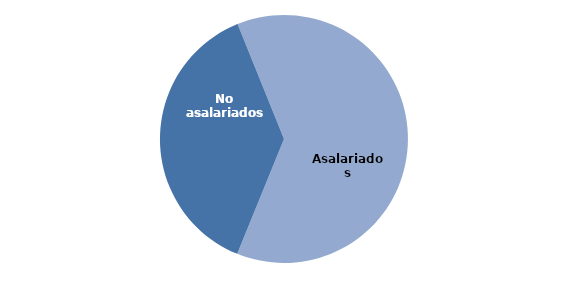
| Category | Series 0 |
|---|---|
| Asalariados | 62.264 |
| No asalariados | 37.736 |